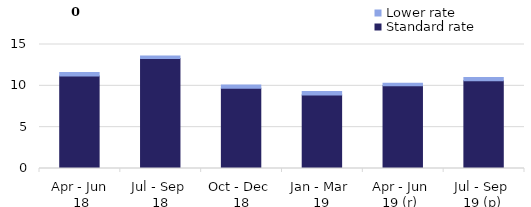
| Category | Standard rate | Lower rate |
|---|---|---|
| Apr - Jun
 18 | 11.2 | 0.4 |
| Jul - Sep 
18 | 13.3 | 0.3 |
| Oct - Dec 
18 | 9.7 | 0.4 |
| Jan - Mar 
19 | 8.9 | 0.4 |
| Apr - Jun 
19 (r)  | 10 | 0.3 |
| Jul - Sep 
19 (p) | 10.6 | 0.4 |